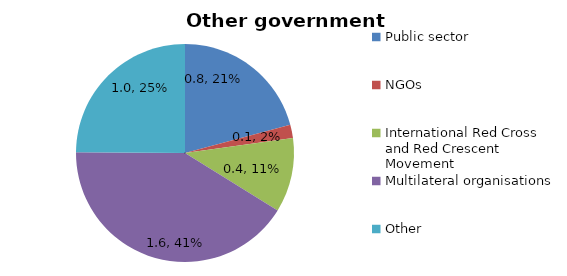
| Category | Other |
|---|---|
| Public sector | 0.797 |
| NGOs | 0.076 |
| International Red Cross and Red Crescent Movement  | 0.422 |
| Multilateral organisations | 1.58 |
| Other | 0.952 |